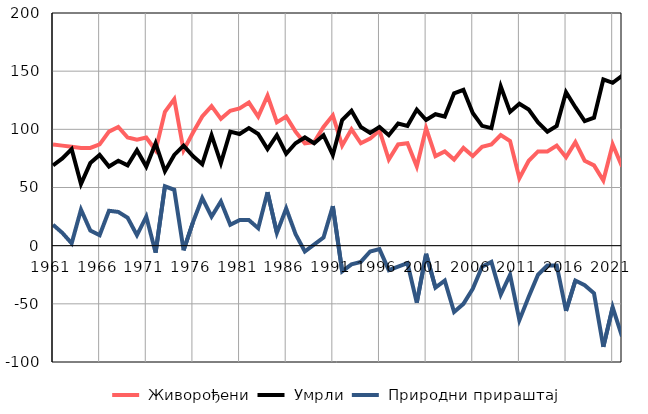
| Category |  Живорођени |  Умрли |  Природни прираштај |
|---|---|---|---|
| 1961.0 | 87 | 69 | 18 |
| 1962.0 | 86 | 75 | 11 |
| 1963.0 | 85 | 83 | 2 |
| 1964.0 | 84 | 53 | 31 |
| 1965.0 | 84 | 71 | 13 |
| 1966.0 | 87 | 78 | 9 |
| 1967.0 | 98 | 68 | 30 |
| 1968.0 | 102 | 73 | 29 |
| 1969.0 | 93 | 69 | 24 |
| 1970.0 | 91 | 82 | 9 |
| 1971.0 | 93 | 68 | 25 |
| 1972.0 | 82 | 88 | -6 |
| 1973.0 | 115 | 64 | 51 |
| 1974.0 | 126 | 78 | 48 |
| 1975.0 | 82 | 86 | -4 |
| 1976.0 | 97 | 77 | 20 |
| 1977.0 | 111 | 70 | 41 |
| 1978.0 | 120 | 95 | 25 |
| 1979.0 | 109 | 71 | 38 |
| 1980.0 | 116 | 98 | 18 |
| 1981.0 | 118 | 96 | 22 |
| 1982.0 | 123 | 101 | 22 |
| 1983.0 | 111 | 96 | 15 |
| 1984.0 | 129 | 83 | 46 |
| 1985.0 | 106 | 95 | 11 |
| 1986.0 | 111 | 79 | 32 |
| 1987.0 | 98 | 88 | 10 |
| 1988.0 | 88 | 93 | -5 |
| 1989.0 | 89 | 88 | 1 |
| 1990.0 | 102 | 95 | 7 |
| 1991.0 | 112 | 78 | 34 |
| 1992.0 | 86 | 108 | -22 |
| 1993.0 | 100 | 116 | -16 |
| 1994.0 | 88 | 102 | -14 |
| 1995.0 | 92 | 97 | -5 |
| 1996.0 | 99 | 102 | -3 |
| 1997.0 | 74 | 95 | -21 |
| 1998.0 | 87 | 105 | -18 |
| 1999.0 | 88 | 103 | -15 |
| 2000.0 | 68 | 117 | -49 |
| 2001.0 | 101 | 108 | -7 |
| 2002.0 | 77 | 113 | -36 |
| 2003.0 | 81 | 111 | -30 |
| 2004.0 | 74 | 131 | -57 |
| 2005.0 | 84 | 134 | -50 |
| 2006.0 | 77 | 114 | -37 |
| 2007.0 | 85 | 103 | -18 |
| 2008.0 | 87 | 101 | -14 |
| 2009.0 | 95 | 137 | -42 |
| 2010.0 | 90 | 115 | -25 |
| 2011.0 | 58 | 122 | -64 |
| 2012.0 | 73 | 117 | -44 |
| 2013.0 | 81 | 106 | -25 |
| 2014.0 | 81 | 98 | -17 |
| 2015.0 | 86 | 103 | -17 |
| 2016.0 | 76 | 132 | -56 |
| 2017.0 | 89 | 119 | -30 |
| 2018.0 | 73 | 107 | -34 |
| 2019.0 | 69 | 110 | -41 |
| 2020.0 | 56 | 143 | -87 |
| 2021.0 | 87 | 140 | -53 |
| 2022.0 | 68 | 146 | -78 |